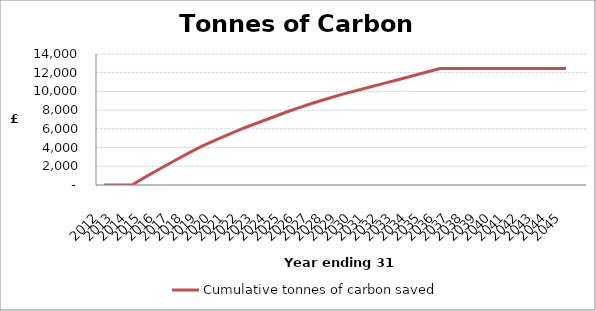
| Category | Cumulative tonnes of carbon saved |
|---|---|
| 2012.0 | 0 |
| 2013.0 | 0 |
| 2014.0 | 0 |
| 2015.0 | 891.335 |
| 2016.0 | 1741.213 |
| 2017.0 | 2570.362 |
| 2018.0 | 3378.782 |
| 2019.0 | 4145.745 |
| 2020.0 | 4829.793 |
| 2021.0 | 5472.384 |
| 2022.0 | 6094.245 |
| 2023.0 | 6653.921 |
| 2024.0 | 7213.597 |
| 2025.0 | 7773.272 |
| 2026.0 | 8291.49 |
| 2027.0 | 8788.98 |
| 2028.0 | 9245.012 |
| 2029.0 | 9680.315 |
| 2030.0 | 10074.161 |
| 2031.0 | 10468.007 |
| 2032.0 | 10861.853 |
| 2033.0 | 11255.698 |
| 2034.0 | 11649.544 |
| 2035.0 | 12043.39 |
| 2036.0 | 12437.236 |
| 2037.0 | 12437.236 |
| 2038.0 | 12437.236 |
| 2039.0 | 12437.236 |
| 2040.0 | 12437.236 |
| 2041.0 | 12437.236 |
| 2042.0 | 12437.236 |
| 2043.0 | 12437.236 |
| 2044.0 | 12437.236 |
| 2045.0 | 12437.236 |